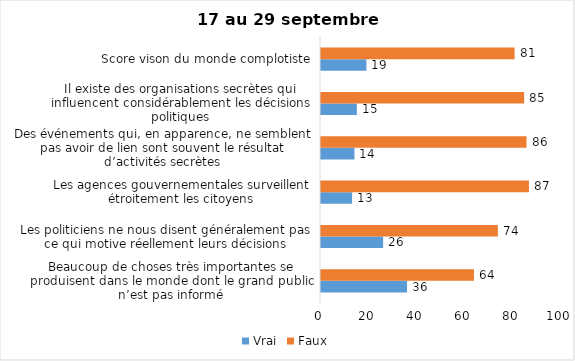
| Category | Vrai | Faux |
|---|---|---|
| Beaucoup de choses très importantes se produisent dans le monde dont le grand public n’est pas informé | 36 | 64 |
| Les politiciens ne nous disent généralement pas ce qui motive réellement leurs décisions | 26 | 74 |
| Les agences gouvernementales surveillent étroitement les citoyens | 13 | 87 |
| Des événements qui, en apparence, ne semblent pas avoir de lien sont souvent le résultat d’activités secrètes | 14 | 86 |
| Il existe des organisations secrètes qui influencent considérablement les décisions politiques | 15 | 85 |
| Score vison du monde complotiste | 19 | 81 |